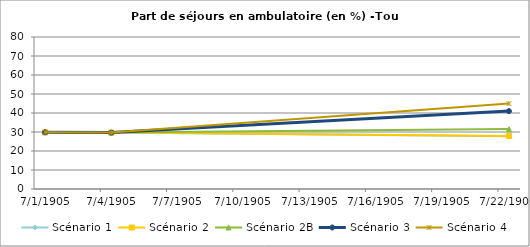
| Category | Scénario 1 | Scénario 2 | Scénario 2B | Scénario 3 | Scénario 4 |
|---|---|---|---|---|---|
| 2009.0 | 29.861 | 29.861 | 29.861 | 29.861 | 29.861 |
| 2012.0 | 29.704 | 29.704 | 29.704 | 29.704 | 29.704 |
| 2030.0 | 27.768 | 27.945 | 31.522 | 40.994 | 44.947 |